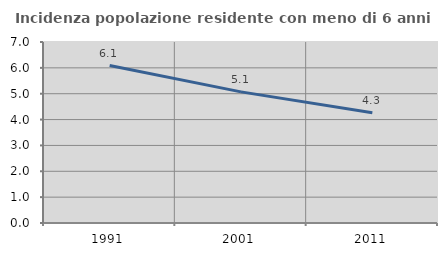
| Category | Incidenza popolazione residente con meno di 6 anni |
|---|---|
| 1991.0 | 6.089 |
| 2001.0 | 5.071 |
| 2011.0 | 4.263 |